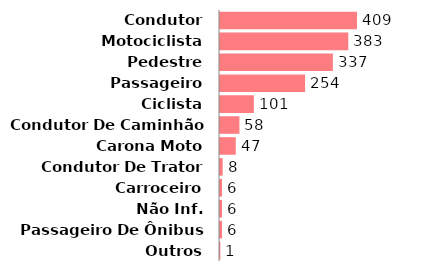
| Category | Qtde |
|---|---|
| Condutor | 409 |
| Motociclista | 383 |
| Pedestre | 337 |
| Passageiro | 254 |
| Ciclista | 101 |
| Condutor De Caminhão | 58 |
| Carona Moto | 47 |
| Condutor De Trator | 8 |
| Carroceiro | 6 |
| Não Inf. | 6 |
| Passageiro De Ônibus | 6 |
| Outros | 1 |